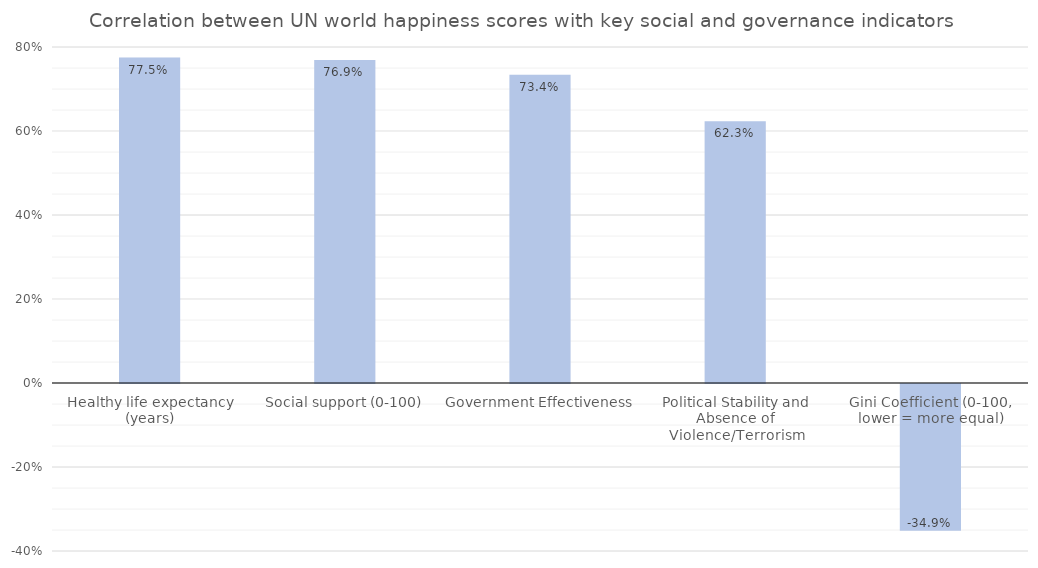
| Category | Series 0 |
|---|---|
| Healthy life expectancy (years) | 0.775 |
| Social support (0-100) | 0.769 |
| Government Effectiveness | 0.734 |
| Political Stability and Absence of Violence/Terrorism | 0.623 |
| Gini Coefficient (0-100, lower = more equal) | -0.349 |